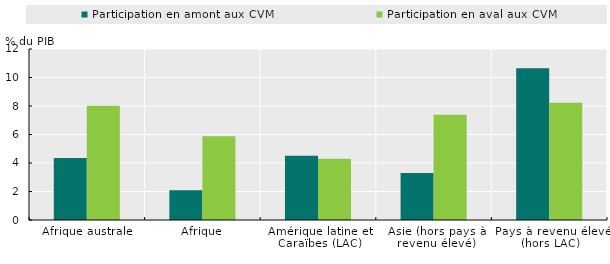
| Category | Participation en amont aux CVM | Participation en aval aux CVM |
|---|---|---|
| Afrique australe | 4.344 | 8.01 |
| Afrique | 2.079 | 5.879 |
| Amérique latine et Caraïbes (LAC) | 4.501 | 4.3 |
| Asie (hors pays à revenu élevé) | 3.292 | 7.38 |
| Pays à revenu élevé (hors LAC) | 10.656 | 8.23 |